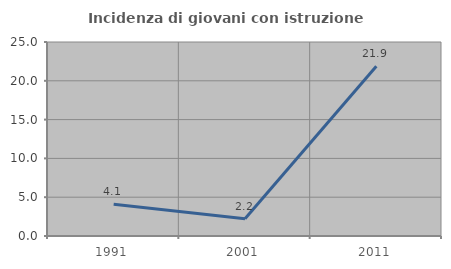
| Category | Incidenza di giovani con istruzione universitaria |
|---|---|
| 1991.0 | 4.082 |
| 2001.0 | 2.222 |
| 2011.0 | 21.875 |